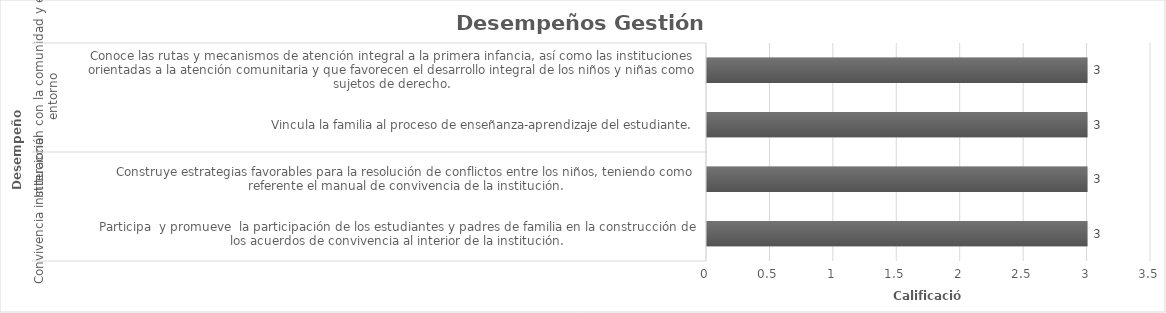
| Category | Series 0 |
|---|---|
| 0 | 3 |
| 1 | 3 |
| 2 | 3 |
| 3 | 3 |